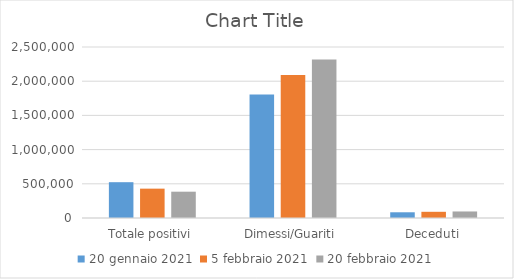
| Category | 20 gennaio 2021 | 5 febbraio 2021 | 20 febbraio 2021 |
|---|---|---|---|
| Totale positivi | 523553 | 429118 | 384623 |
| Dimessi/Guariti | 1806932 | 2091923 | 2315687 |
| Deceduti | 83681 | 90618 | 95486 |